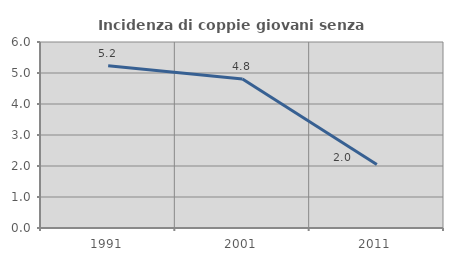
| Category | Incidenza di coppie giovani senza figli |
|---|---|
| 1991.0 | 5.233 |
| 2001.0 | 4.805 |
| 2011.0 | 2.046 |